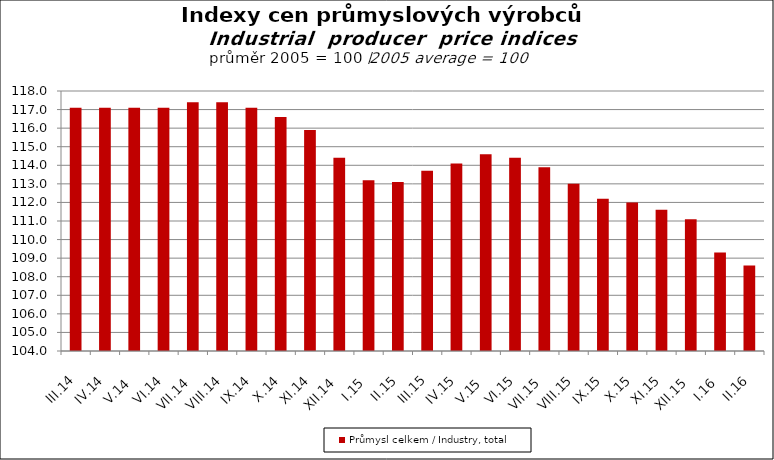
| Category | Průmysl celkem / Industry, total |
|---|---|
| III.14 | 117.1 |
| IV.14 | 117.1 |
| V.14 | 117.1 |
| VI.14 | 117.1 |
| VII.14 | 117.4 |
| VIII.14 | 117.4 |
| IX.14 | 117.1 |
| X.14 | 116.6 |
| XI.14 | 115.9 |
| XII.14 | 114.4 |
| I.15 | 113.2 |
| II.15 | 113.1 |
| III.15 | 113.7 |
| IV.15 | 114.1 |
| V.15 | 114.6 |
| VI.15 | 114.4 |
| VII.15 | 113.9 |
| VIII.15 | 113 |
| IX.15 | 112.2 |
| X.15 | 112 |
| XI.15 | 111.6 |
| XII.15 | 111.1 |
| I.16 | 109.3 |
| II.16 | 108.6 |